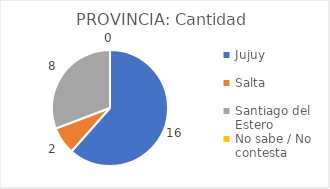
| Category | PROVINCIA: |
|---|---|
| Jujuy  | 0.615 |
| Salta  | 0.077 |
| Santiago del Estero  | 0.308 |
| No sabe / No contesta | 0 |